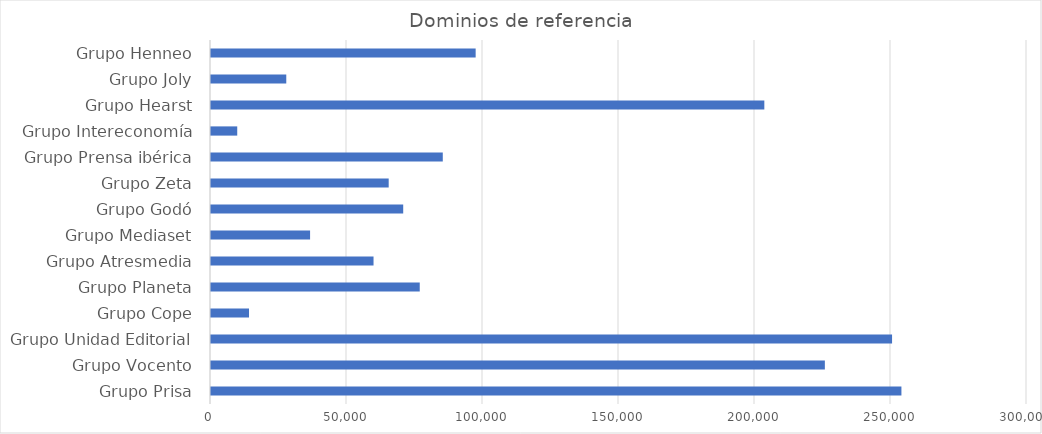
| Category | Dominios de referencia |
|---|---|
| Grupo Prisa | 253833 |
| Grupo Vocento | 225685 |
| Grupo Unidad Editorial | 250392 |
| Grupo Cope | 13974 |
| Grupo Planeta | 76746 |
| Grupo Atresmedia | 59755 |
| Grupo Mediaset | 36426 |
| Grupo Godó | 70665 |
| Grupo Zeta | 65328 |
| Grupo Prensa ibérica | 85215 |
| Grupo Intereconomía | 9645 |
| Grupo Hearst | 203430 |
| Grupo Joly | 27673 |
| Grupo Henneo | 97300 |